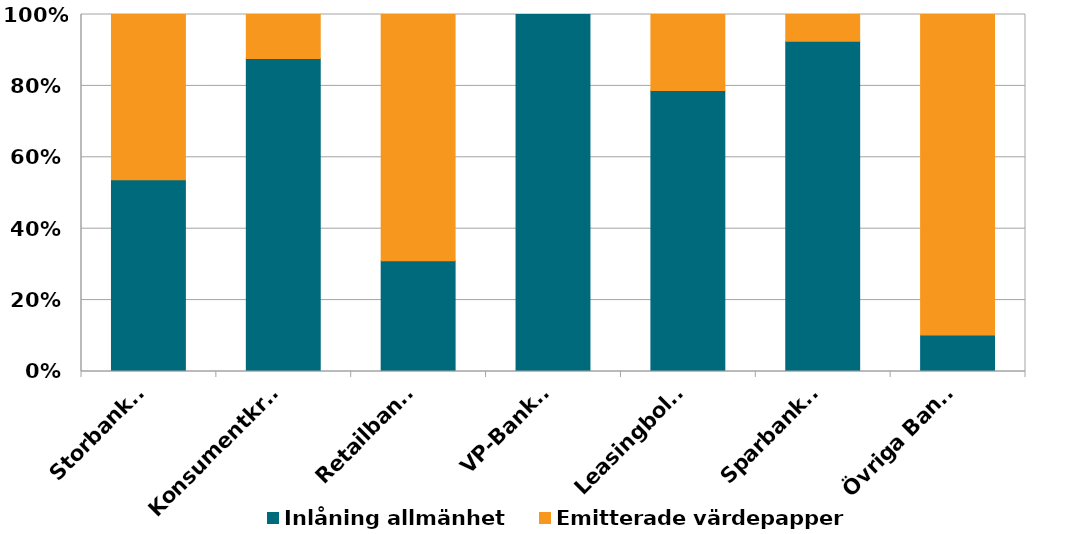
| Category | Inlåning allmänhet | Emitterade värdepapper |
|---|---|---|
| Storbanker | 0.537 | 0.463 |
| Konsumentkredit | 0.876 | 0.124 |
| Retailbanker | 0.31 | 0.69 |
| VP-Banker | 1 | 0 |
| Leasingbolag | 0.787 | 0.213 |
| Sparbanker | 0.925 | 0.075 |
| Övriga Banker | 0.103 | 0.897 |